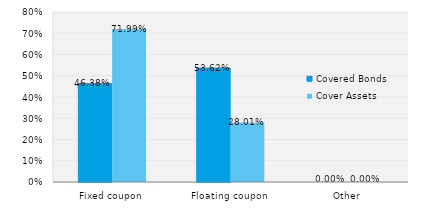
| Category | Covered Bonds | Cover Assets |
|---|---|---|
| Fixed coupon | 0.464 | 0.72 |
| Floating coupon | 0.536 | 0.28 |
| Other | 0 | 0 |